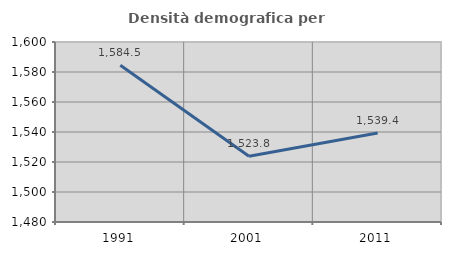
| Category | Densità demografica |
|---|---|
| 1991.0 | 1584.546 |
| 2001.0 | 1523.779 |
| 2011.0 | 1539.383 |